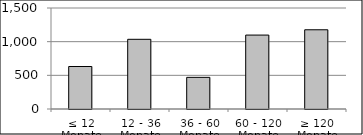
| Category | Volumen |
|---|---|
| ≤ 12 Monate | 631152764.06 |
| 12 - 36 Monate | 1035154372.7 |
| 36 - 60 Monate | 470131559.95 |
| 60 - 120 Monate | 1097971603.07 |
| ≥ 120 Monate | 1176706145.951 |